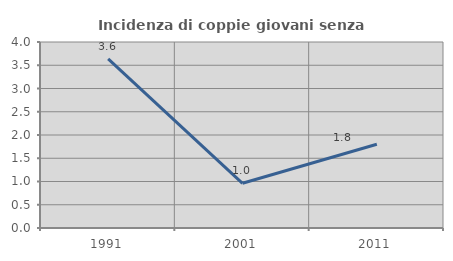
| Category | Incidenza di coppie giovani senza figli |
|---|---|
| 1991.0 | 3.636 |
| 2001.0 | 0.962 |
| 2011.0 | 1.802 |